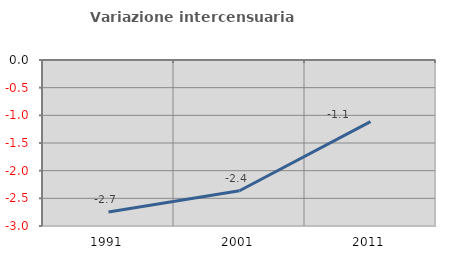
| Category | Variazione intercensuaria annua |
|---|---|
| 1991.0 | -2.748 |
| 2001.0 | -2.364 |
| 2011.0 | -1.115 |